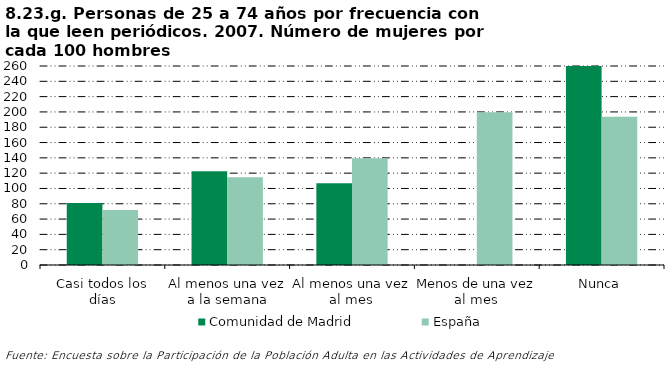
| Category | Comunidad de Madrid | España |
|---|---|---|
| Casi todos los días | 81.072 | 71.984 |
| Al menos una vez a la semana | 122.382 | 114.591 |
| Al menos una vez al mes | 106.905 | 139.575 |
| Menos de una vez al mes | 0 | 199.585 |
| Nunca | 266.307 | 193.707 |